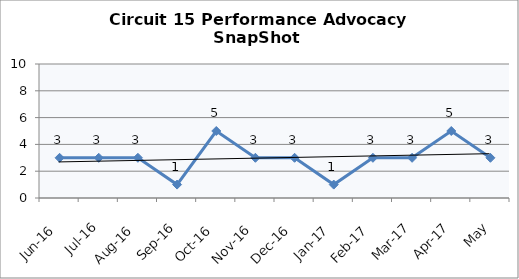
| Category | Circuit 15 |
|---|---|
| Jun-16 | 3 |
| Jul-16 | 3 |
| Aug-16 | 3 |
| Sep-16 | 1 |
| Oct-16 | 5 |
| Nov-16 | 3 |
| Dec-16 | 3 |
| Jan-17 | 1 |
| Feb-17 | 3 |
| Mar-17 | 3 |
| Apr-17 | 5 |
| May | 3 |